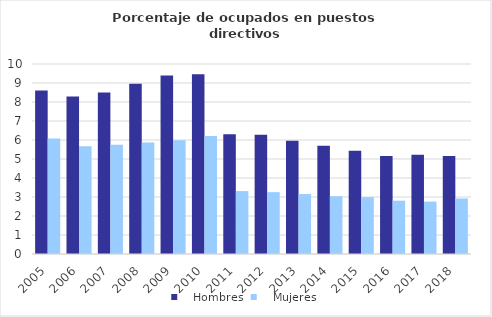
| Category |    Hombres |    Mujeres |
|---|---|---|
| 2005.0 | 8.601 | 6.077 |
| 2006.0 | 8.295 | 5.669 |
| 2007.0 | 8.497 | 5.749 |
| 2008.0 | 8.966 | 5.871 |
| 2009.0 | 9.394 | 5.991 |
| 2010.0 | 9.458 | 6.21 |
| 2011.0 | 6.308 | 3.311 |
| 2012.0 | 6.279 | 3.254 |
| 2013.0 | 5.963 | 3.155 |
| 2014.0 | 5.695 | 3.041 |
| 2015.0 | 5.437 | 2.993 |
| 2016.0 | 5.161 | 2.806 |
| 2017.0 | 5.22 | 2.759 |
| 2018.0 | 5.152 | 2.921 |